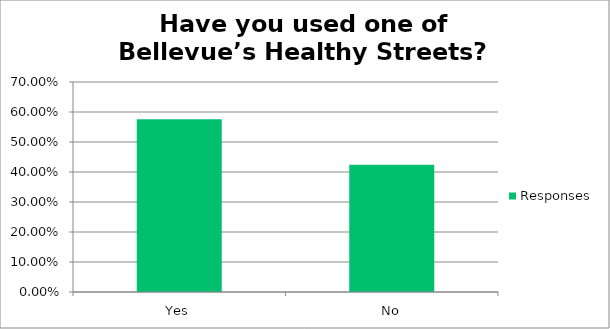
| Category | Responses |
|---|---|
| Yes | 0.576 |
| No | 0.424 |